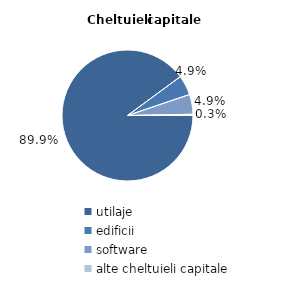
| Category | Series 0 |
|---|---|
| utilaje | 89.9 |
| edificii | 4.9 |
| software | 4.9 |
| alte cheltuieli capitale | 0.3 |